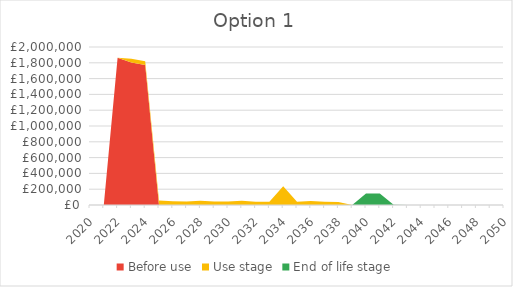
| Category | Before use | Use stage | End of life stage |
|---|---|---|---|
| 2020 | 0 | 0 | 0 |
| 2021 | 0 | 0 | 0 |
| 2022 | 1863110.67 | 0 | 0 |
| 2023 | 1803010.326 | 47928.123 | 0 |
| 2024 | 1771401.874 | 47087.898 | 0 |
| 2025 | 0 | 57597.499 | 0 |
| 2026 | 0 | 45950.161 | 0 |
| 2027 | 0 | 45331.754 | 0 |
| 2028 | 0 | 55357.353 | 0 |
| 2029 | 0 | 44090.606 | 0 |
| 2030 | 0 | 43468.999 | 0 |
| 2031 | 0 | 53235.967 | 0 |
| 2032 | 0 | 42372.95 | 0 |
| 2033 | 0 | 41748.714 | 0 |
| 2034 | 0 | 237762.003 | 0 |
| 2035 | 0 | 40639.811 | 0 |
| 2036 | 0 | 49707.485 | 0 |
| 2037 | 0 | 39652.318 | 0 |
| 2038 | 0 | 39028.845 | 0 |
| 2039 | 0 | 0 | 0 |
| 2040 | 0 | 0 | 144862.56 |
| 2041 | 0 | 0 | 146512.621 |
| 2042 | 0 | 0 | 3525.227 |
| 2043 | 0 | 0 | 0 |
| 2044 | 0 | 0 | 0 |
| 2045 | 0 | 0 | 0 |
| 2046 | 0 | 0 | 0 |
| 2047 | 0 | 0 | 0 |
| 2048 | 0 | 0 | 0 |
| 2049 | 0 | 0 | 0 |
| 2050 | 0 | 0 | 0 |